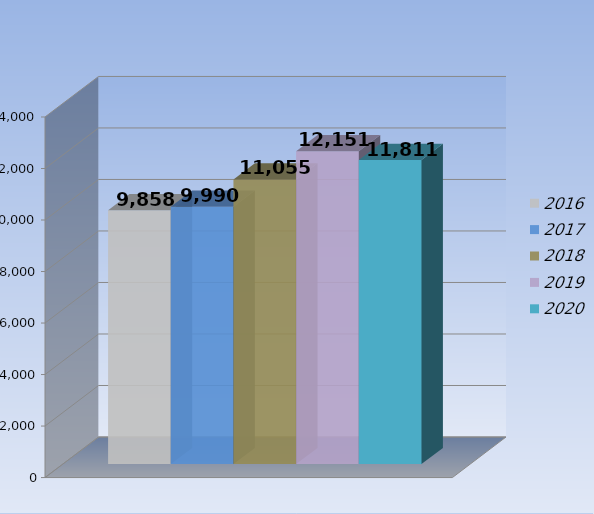
| Category | 2016 | 2017 | 2018 | 2019 | 2020 |
|---|---|---|---|---|---|
| 0 | 9858 | 9990 | 11055 | 12151 | 11811 |